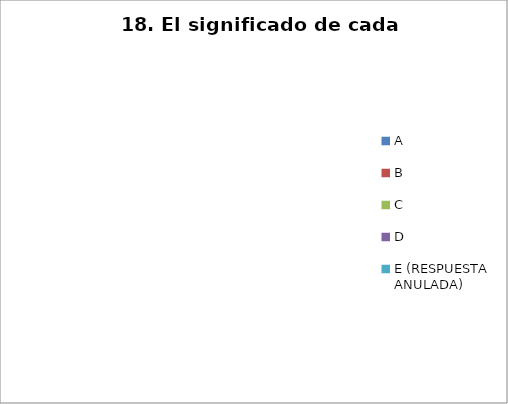
| Category | CANTIDAD DE RESPUESTAS PREGUNTA (18) | PORCENTAJE |
|---|---|---|
| A | 0 | 0 |
| B | 0 | 0 |
| C | 0 | 0 |
| D | 0 | 0 |
| E (RESPUESTA ANULADA) | 0 | 0 |